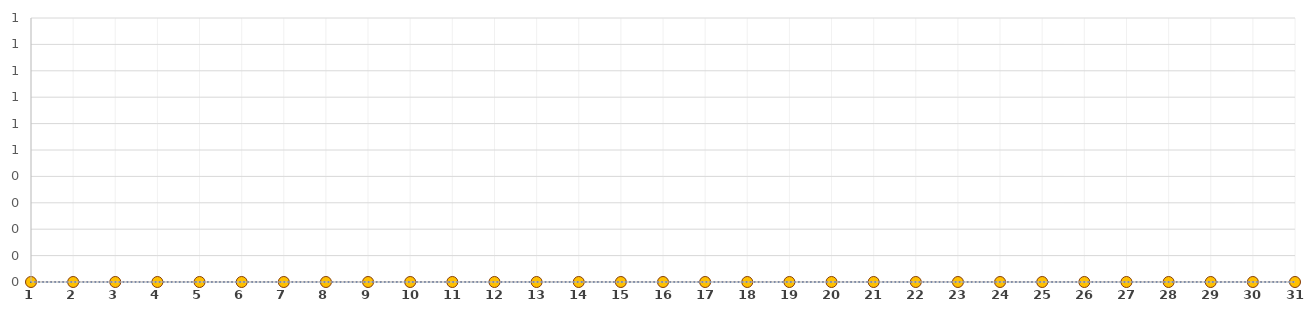
| Category | Series 0 |
|---|---|
| 1.0 | 0 |
| 2.0 | 0 |
| 3.0 | 0 |
| 4.0 | 0 |
| 5.0 | 0 |
| 6.0 | 0 |
| 7.0 | 0 |
| 8.0 | 0 |
| 9.0 | 0 |
| 10.0 | 0 |
| 11.0 | 0 |
| 12.0 | 0 |
| 13.0 | 0 |
| 14.0 | 0 |
| 15.0 | 0 |
| 16.0 | 0 |
| 17.0 | 0 |
| 18.0 | 0 |
| 19.0 | 0 |
| 20.0 | 0 |
| 21.0 | 0 |
| 22.0 | 0 |
| 23.0 | 0 |
| 24.0 | 0 |
| 25.0 | 0 |
| 26.0 | 0 |
| 27.0 | 0 |
| 28.0 | 0 |
| 29.0 | 0 |
| 30.0 | 0 |
| 31.0 | 0 |